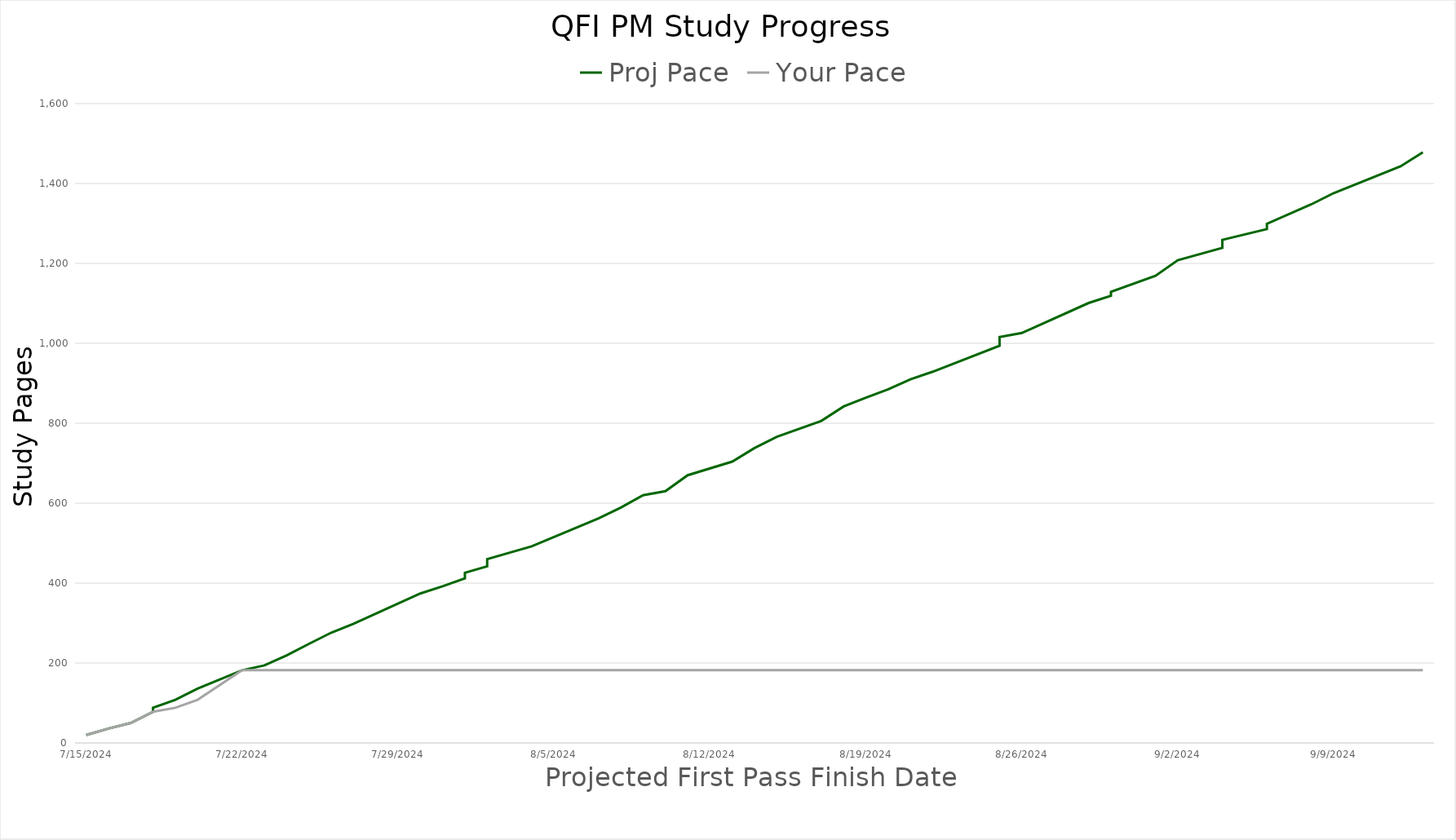
| Category | Proj Pace | Your Pace |
|---|---|---|
| 7/15/24 | 20 | 20 |
| 7/16/24 | 36 | 36 |
| 7/17/24 | 50 | 50 |
| 7/18/24 | 78 | 78 |
| 7/18/24 | 88 | 78 |
| 7/19/24 | 108 | 88 |
| 7/20/24 | 136 | 108 |
| 7/22/24 | 182 | 182 |
| 7/23/24 | 194 | 182 |
| 7/24/24 | 219 | 182 |
| 7/25/24 | 248 | 182 |
| 7/26/24 | 276 | 182 |
| 7/27/24 | 298 | 182 |
| 7/30/24 | 374 | 182 |
| 7/30/24 | 374 | 182 |
| 7/31/24 | 392 | 182 |
| 8/1/24 | 412 | 182 |
| 8/1/24 | 426 | 182 |
| 8/2/24 | 442 | 182 |
| 8/2/24 | 460 | 182 |
| 8/4/24 | 492 | 182 |
| 8/4/24 | 492 | 182 |
| 8/7/24 | 562 | 182 |
| 8/8/24 | 589 | 182 |
| 8/9/24 | 620 | 182 |
| 8/10/24 | 630 | 182 |
| 8/11/24 | 670 | 182 |
| 8/13/24 | 704 | 182 |
| 8/14/24 | 738 | 182 |
| 8/15/24 | 766 | 182 |
| 8/17/24 | 806 | 182 |
| 8/18/24 | 842 | 182 |
| 8/19/24 | 864 | 182 |
| 8/20/24 | 885 | 182 |
| 8/21/24 | 910 | 182 |
| 8/21/24 | 910 | 182 |
| 8/22/24 | 929 | 182 |
| 8/25/24 | 994 | 182 |
| 8/25/24 | 1016 | 182 |
| 8/26/24 | 1026 | 182 |
| 8/26/24 | 1026 | 182 |
| 8/29/24 | 1101 | 182 |
| 8/30/24 | 1119 | 182 |
| 8/30/24 | 1129 | 182 |
| 8/30/24 | 1129 | 182 |
| 9/1/24 | 1169 | 182 |
| 9/2/24 | 1208 | 182 |
| 9/4/24 | 1239 | 182 |
| 9/4/24 | 1259 | 182 |
| 9/6/24 | 1286 | 182 |
| 9/6/24 | 1299 | 182 |
| 9/8/24 | 1348 | 182 |
| 9/9/24 | 1376 | 182 |
| 9/9/24 | 1376 | 182 |
| 9/12/24 | 1443 | 182 |
| 9/14/24 | 1478 | 182 |
| 9/14/24 | 1478 | 182 |